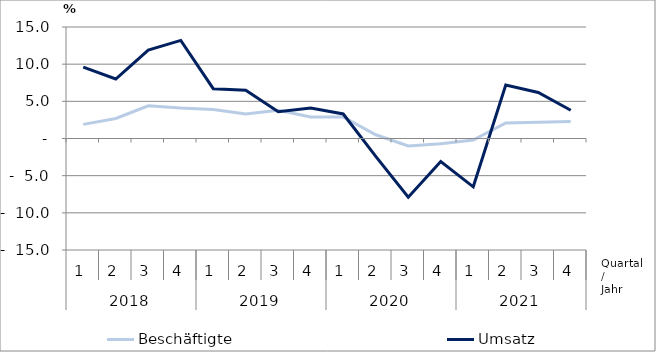
| Category | Beschäftigte | Umsatz |
|---|---|---|
| 0 | 1.9 | 9.6 |
| 1 | 2.7 | 8 |
| 2 | 4.4 | 11.9 |
| 3 | 4.1 | 13.2 |
| 4 | 3.9 | 6.7 |
| 5 | 3.3 | 6.5 |
| 6 | 3.8 | 3.6 |
| 7 | 2.9 | 4.1 |
| 8 | 2.9 | 3.3 |
| 9 | 0.5 | -2.4 |
| 10 | -1 | -7.9 |
| 11 | -0.7 | -3.1 |
| 12 | -0.2 | -6.5 |
| 13 | 2.1 | 7.2 |
| 14 | 2.2 | 6.2 |
| 15 | 2.3 | 3.8 |